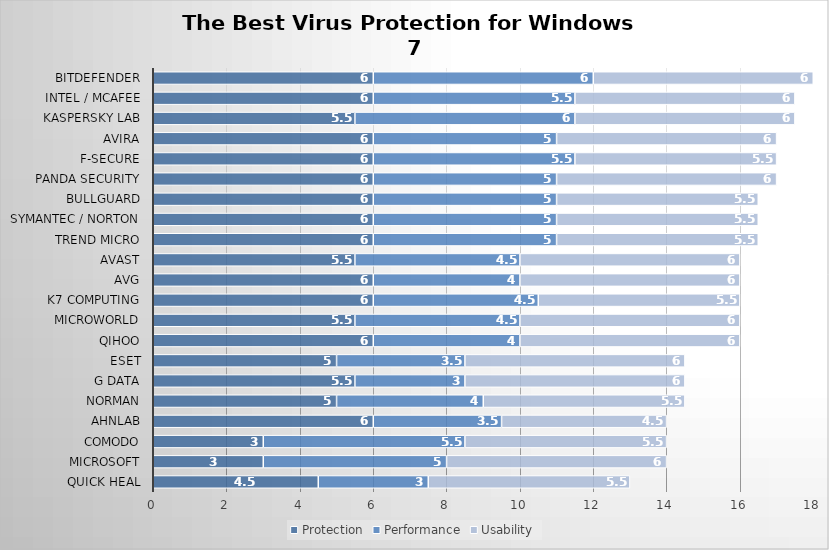
| Category | Protection | Performance | Usability |
|---|---|---|---|
| Quick Heal | 4.5 | 3 | 5.5 |
| Microsoft | 3 | 5 | 6 |
| Comodo | 3 | 5.5 | 5.5 |
| AhnLab | 6 | 3.5 | 4.5 |
| Norman | 5 | 4 | 5.5 |
| G Data | 5.5 | 3 | 6 |
| ESET | 5 | 3.5 | 6 |
| Qihoo | 6 | 4 | 6 |
| Microworld | 5.5 | 4.5 | 6 |
| K7 Computing | 6 | 4.5 | 5.5 |
| AVG | 6 | 4 | 6 |
| Avast | 5.5 | 4.5 | 6 |
| Trend Micro | 6 | 5 | 5.5 |
| Symantec / Norton | 6 | 5 | 5.5 |
| BullGuard | 6 | 5 | 5.5 |
| Panda Security | 6 | 5 | 6 |
| F-Secure | 6 | 5.5 | 5.5 |
| Avira | 6 | 5 | 6 |
| Kaspersky Lab | 5.5 | 6 | 6 |
| Intel / McAfee | 6 | 5.5 | 6 |
| Bitdefender | 6 | 6 | 6 |